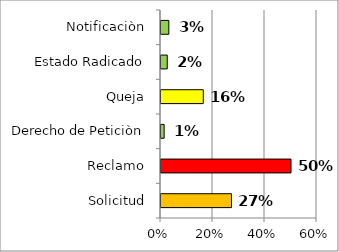
| Category | Series 0 |
|---|---|
| Solicitud | 0.271 |
| Reclamo | 0.5 |
| Derecho de Peticiòn | 0.012 |
| Queja | 0.163 |
| Estado Radicado | 0.024 |
| Notificaciòn | 0.03 |